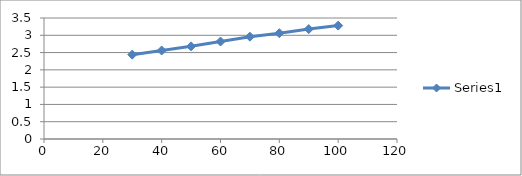
| Category | Series 0 |
|---|---|
| 100.0 | 3.28 |
| 90.0 | 3.18 |
| 80.0 | 3.06 |
| 70.0 | 2.96 |
| 60.0 | 2.82 |
| 50.0 | 2.68 |
| 40.0 | 2.56 |
| 30.0 | 2.44 |